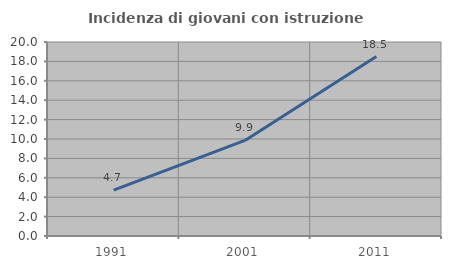
| Category | Incidenza di giovani con istruzione universitaria |
|---|---|
| 1991.0 | 4.739 |
| 2001.0 | 9.856 |
| 2011.0 | 18.497 |